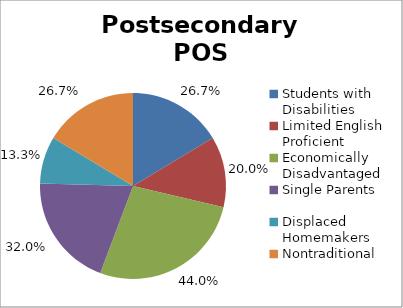
| Category | Series 0 |
|---|---|
| Students with Disabilities | 0.267 |
| Limited English Proficient | 0.2 |
| Economically Disadvantaged | 0.44 |
| Single Parents | 0.32 |
| Displaced Homemakers | 0.133 |
| Nontraditional | 0.267 |